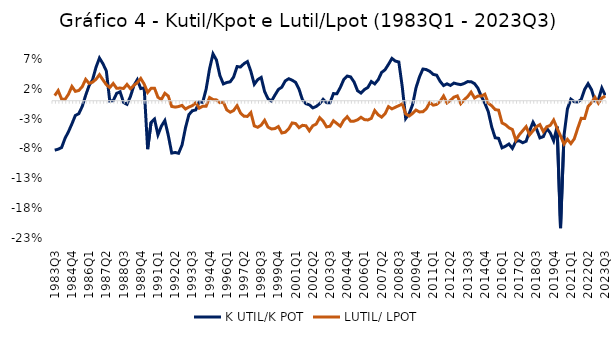
| Category | K UTIL/K POT | LUTIL/ LPOT |
|---|---|---|
| 1983Q3 | -0.083 | 0.009 |
| 1983Q4 | -0.081 | 0.017 |
| 1984Q1 | -0.078 | 0.003 |
| 1984Q2 | -0.063 | 0.002 |
| 1984Q3 | -0.052 | 0.011 |
| 1984Q4 | -0.039 | 0.024 |
| 1985Q1 | -0.025 | 0.016 |
| 1985Q2 | -0.022 | 0.017 |
| 1985Q3 | -0.01 | 0.024 |
| 1985Q4 | 0.009 | 0.036 |
| 1986Q1 | 0.025 | 0.029 |
| 1986Q2 | 0.035 | 0.031 |
| 1986Q3 | 0.056 | 0.036 |
| 1986Q4 | 0.072 | 0.044 |
| 1987Q1 | 0.062 | 0.035 |
| 1987Q2 | 0.05 | 0.027 |
| 1987Q3 | -0.001 | 0.022 |
| 1987Q4 | 0 | 0.029 |
| 1988Q1 | 0.012 | 0.021 |
| 1988Q2 | 0.015 | 0.021 |
| 1988Q3 | -0.003 | 0.02 |
| 1988Q4 | -0.006 | 0.027 |
| 1989Q1 | 0.007 | 0.02 |
| 1989Q2 | 0.025 | 0.026 |
| 1989Q3 | 0.035 | 0.03 |
| 1989Q4 | 0.02 | 0.037 |
| 1990Q1 | 0.021 | 0.028 |
| 1990Q2 | -0.081 | 0.014 |
| 1990Q3 | -0.036 | 0.021 |
| 1990Q4 | -0.031 | 0.021 |
| 1991Q1 | -0.057 | 0.006 |
| 1991Q2 | -0.043 | 0.002 |
| 1991Q3 | -0.033 | 0.012 |
| 1991Q4 | -0.058 | 0.008 |
| 1992Q1 | -0.088 | -0.01 |
| 1992Q2 | -0.087 | -0.011 |
| 1992Q3 | -0.088 | -0.01 |
| 1992Q4 | -0.074 | -0.008 |
| 1993Q1 | -0.045 | -0.014 |
| 1993Q2 | -0.023 | -0.011 |
| 1993Q3 | -0.017 | -0.008 |
| 1993Q4 | -0.015 | -0.003 |
| 1994Q1 | -0.002 | -0.012 |
| 1994Q2 | -0.003 | -0.009 |
| 1994Q3 | 0.019 | -0.009 |
| 1994Q4 | 0.053 | 0.005 |
| 1995Q1 | 0.079 | 0.002 |
| 1995Q2 | 0.068 | 0.001 |
| 1995Q3 | 0.042 | -0.003 |
| 1995Q4 | 0.028 | -0.002 |
| 1996Q1 | 0.031 | -0.015 |
| 1996Q2 | 0.032 | -0.019 |
| 1996Q3 | 0.04 | -0.016 |
| 1996Q4 | 0.057 | -0.008 |
| 1997Q1 | 0.056 | -0.021 |
| 1997Q2 | 0.062 | -0.026 |
| 1997Q3 | 0.066 | -0.026 |
| 1997Q4 | 0.049 | -0.02 |
| 1998Q1 | 0.028 | -0.042 |
| 1998Q2 | 0.035 | -0.045 |
| 1998Q3 | 0.039 | -0.041 |
| 1998Q4 | 0.015 | -0.033 |
| 1999Q1 | 0.003 | -0.044 |
| 1999Q2 | -0.001 | -0.047 |
| 1999Q3 | 0.009 | -0.047 |
| 1999Q4 | 0.019 | -0.043 |
| 2000Q1 | 0.023 | -0.054 |
| 2000Q2 | 0.033 | -0.053 |
| 2000Q3 | 0.037 | -0.047 |
| 2000Q4 | 0.034 | -0.037 |
| 2001Q1 | 0.031 | -0.038 |
| 2001Q2 | 0.019 | -0.045 |
| 2001Q3 | 0.001 | -0.041 |
| 2001Q4 | -0.005 | -0.042 |
| 2002Q1 | -0.007 | -0.05 |
| 2002Q2 | -0.012 | -0.042 |
| 2002Q3 | -0.01 | -0.039 |
| 2002Q4 | -0.005 | -0.029 |
| 2003Q1 | 0.002 | -0.034 |
| 2003Q2 | -0.003 | -0.044 |
| 2003Q3 | -0.003 | -0.043 |
| 2003Q4 | 0.012 | -0.034 |
| 2004Q1 | 0.012 | -0.038 |
| 2004Q2 | 0.022 | -0.043 |
| 2004Q3 | 0.035 | -0.033 |
| 2004Q4 | 0.041 | -0.027 |
| 2005Q1 | 0.04 | -0.034 |
| 2005Q2 | 0.031 | -0.034 |
| 2005Q3 | 0.017 | -0.032 |
| 2005Q4 | 0.013 | -0.028 |
| 2006Q1 | 0.019 | -0.032 |
| 2006Q2 | 0.022 | -0.032 |
| 2006Q3 | 0.032 | -0.03 |
| 2006Q4 | 0.028 | -0.016 |
| 2007Q1 | 0.035 | -0.024 |
| 2007Q2 | 0.047 | -0.028 |
| 2007Q3 | 0.052 | -0.022 |
| 2007Q4 | 0.061 | -0.01 |
| 2008Q1 | 0.071 | -0.014 |
| 2008Q2 | 0.066 | -0.011 |
| 2008Q3 | 0.065 | -0.008 |
| 2008Q4 | 0.023 | -0.005 |
| 2009Q1 | -0.03 | -0.022 |
| 2009Q2 | -0.022 | -0.026 |
| 2009Q3 | -0.007 | -0.021 |
| 2009Q4 | 0.022 | -0.016 |
| 2010Q1 | 0.04 | -0.019 |
| 2010Q2 | 0.053 | -0.018 |
| 2010Q3 | 0.052 | -0.013 |
| 2010Q4 | 0.049 | -0.003 |
| 2011Q1 | 0.044 | -0.007 |
| 2011Q2 | 0.043 | -0.006 |
| 2011Q3 | 0.033 | -0.001 |
| 2011Q4 | 0.025 | 0.008 |
| 2012Q1 | 0.028 | -0.004 |
| 2012Q2 | 0.026 | 0.001 |
| 2012Q3 | 0.03 | 0.006 |
| 2012Q4 | 0.028 | 0.008 |
| 2013Q1 | 0.027 | -0.005 |
| 2013Q2 | 0.029 | 0.002 |
| 2013Q3 | 0.032 | 0.007 |
| 2013Q4 | 0.032 | 0.014 |
| 2014Q1 | 0.029 | 0.005 |
| 2014Q2 | 0.021 | 0.008 |
| 2014Q3 | 0.007 | 0.008 |
| 2014Q4 | -0.004 | 0.011 |
| 2015Q1 | -0.018 | -0.004 |
| 2015Q2 | -0.044 | -0.008 |
| 2015Q3 | -0.062 | -0.015 |
| 2015Q4 | -0.063 | -0.016 |
| 2016Q1 | -0.079 | -0.037 |
| 2016Q2 | -0.076 | -0.04 |
| 2016Q3 | -0.073 | -0.045 |
| 2016Q4 | -0.08 | -0.048 |
| 2017Q1 | -0.068 | -0.066 |
| 2017Q2 | -0.067 | -0.057 |
| 2017Q3 | -0.07 | -0.05 |
| 2017Q4 | -0.068 | -0.043 |
| 2018Q1 | -0.05 | -0.057 |
| 2018Q2 | -0.036 | -0.05 |
| 2018Q3 | -0.047 | -0.044 |
| 2018Q4 | -0.062 | -0.04 |
| 2019Q1 | -0.06 | -0.052 |
| 2019Q2 | -0.046 | -0.044 |
| 2019Q3 | -0.054 | -0.041 |
| 2019Q4 | -0.067 | -0.032 |
| 2020Q1 | -0.043 | -0.046 |
| 2020Q2 | -0.213 | -0.059 |
| 2020Q3 | -0.059 | -0.073 |
| 2020Q4 | -0.014 | -0.065 |
| 2021Q1 | 0.002 | -0.072 |
| 2021Q2 | -0.002 | -0.064 |
| 2021Q3 | -0.002 | -0.046 |
| 2021Q4 | 0.002 | -0.029 |
| 2022Q1 | 0.019 | -0.03 |
| 2022Q2 | 0.029 | -0.01 |
| 2022Q3 | 0.019 | -0.003 |
| 2022Q4 | 0 | 0.006 |
| 2023Q1 | 0.001 | -0.004 |
| 2023Q2 | 0.021 | 0.005 |
| 2023Q3 | 0.009 | 0.008 |